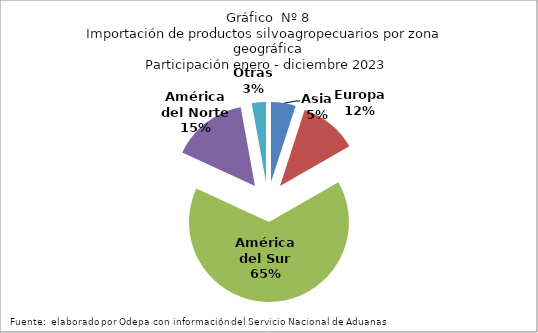
| Category | Series 0 |
|---|---|
| Asia | 428088.723 |
| Europa | 1007676.566 |
| América del Sur | 5601747.989 |
| América del Norte | 1314097.985 |
| Otras | 246383.737 |